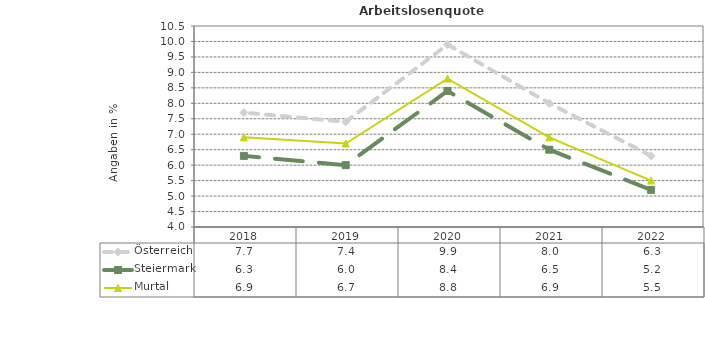
| Category | Österreich | Steiermark | Murtal |
|---|---|---|---|
| 2022.0 | 6.3 | 5.2 | 5.5 |
| 2021.0 | 8 | 6.5 | 6.9 |
| 2020.0 | 9.9 | 8.4 | 8.8 |
| 2019.0 | 7.4 | 6 | 6.7 |
| 2018.0 | 7.7 | 6.3 | 6.9 |